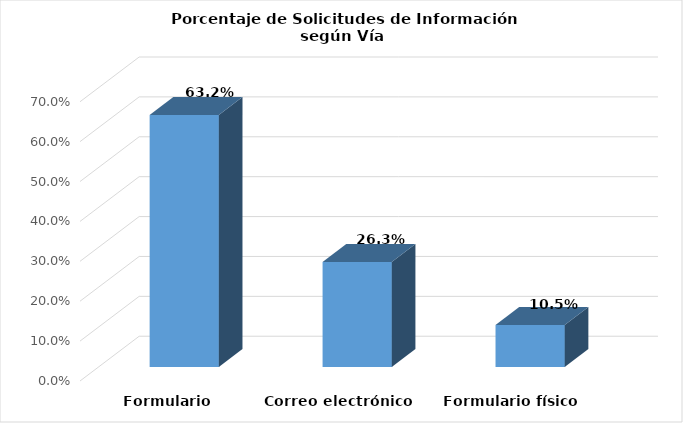
| Category | Series 0 |
|---|---|
| Formulario electrónico SAIP | 0.632 |
| Correo electrónico | 0.263 |
| Formulario físico | 0.105 |